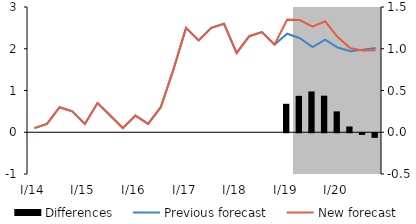
| Category | Differences |
|---|---|
| 0 | 0 |
| 1 | 0 |
| 2 | 0 |
| 3 | 0 |
| 4 | 0 |
| 5 | 0 |
| 6 | 0 |
| 7 | 0 |
| 8 | 0 |
| 9 | 0 |
| 10 | 0 |
| 11 | 0 |
| 12 | 0 |
| 13 | 0 |
| 14 | 0 |
| 15 | 0 |
| 16 | 0 |
| 17 | 0 |
| 18 | 0 |
| 19 | 0 |
| 20 | 0.341 |
| 21 | 0.436 |
| 22 | 0.489 |
| 23 | 0.438 |
| 24 | 0.25 |
| 25 | 0.069 |
| 26 | -0.02 |
| 27 | -0.055 |